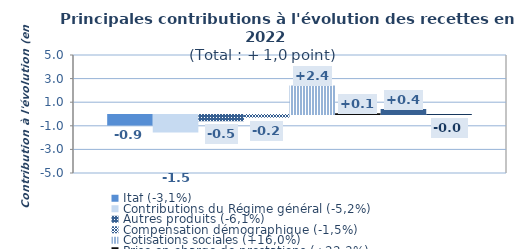
| Category | Itaf (-3,1%) | Contributions du Régime général (-5,2%) | Autres produits (-6,1%) | Compensation démographique (-1,5%) | Cotisations sociales (+16,0%) | Prise en charge de prestations (+22,3%) | Contribution Sociale Généralisée (+16,0%) | Cotisations prises en charge par l'Etat (-11,8%) |
|---|---|---|---|---|---|---|---|---|
| Contri croiss | -0.895 | -1.487 | -0.525 | -0.228 | 2.417 | 0.055 | 0.417 | -0.024 |